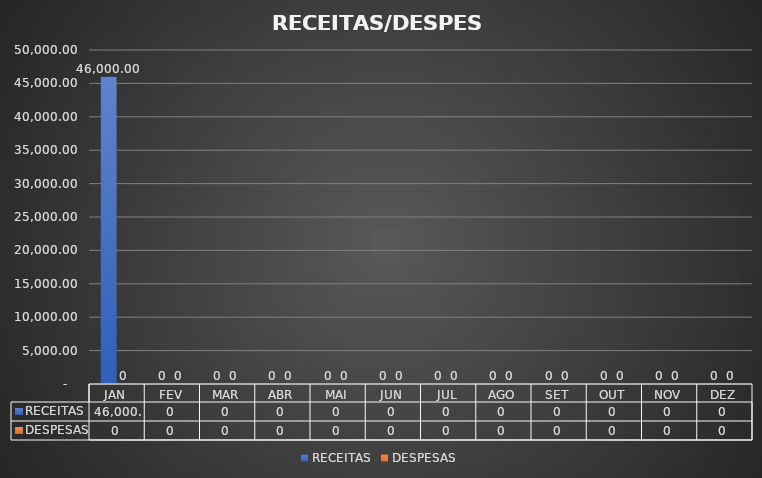
| Category | RECEITAS | DESPESAS |
|---|---|---|
| JAN | 46000 | 0 |
| FEV | 0 | 0 |
| MAR | 0 | 0 |
| ABR | 0 | 0 |
| MAI | 0 | 0 |
| JUN | 0 | 0 |
| JUL | 0 | 0 |
| AGO | 0 | 0 |
| SET | 0 | 0 |
| OUT | 0 | 0 |
| NOV | 0 | 0 |
| DEZ | 0 | 0 |